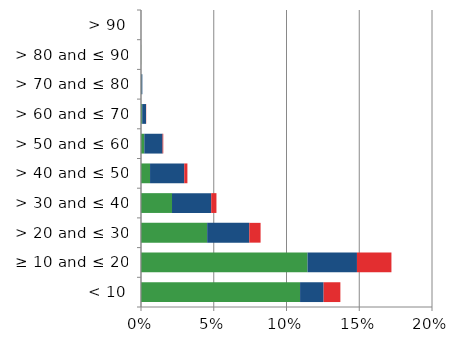
| Category | England | Scotland | Wales |
|---|---|---|---|
|  < 10 | 0.109 | 0.016 | 0.012 |
|  ≥ 10 and ≤ 20 | 0.114 | 0.034 | 0.024 |
|  > 20 and ≤ 30 | 0.045 | 0.029 | 0.008 |
|  > 30 and ≤ 40 | 0.021 | 0.027 | 0.004 |
|  > 40 and ≤ 50 | 0.006 | 0.023 | 0.002 |
|  > 50 and ≤ 60 | 0.002 | 0.013 | 0 |
|  > 60 and ≤ 70 | 0.001 | 0.003 | 0 |
|  > 70 and ≤ 80 | 0 | 0.001 | 0 |
|  > 80 and ≤ 90 | 0 | 0 | 0 |
|  > 90 | 0 | 0 | 0 |